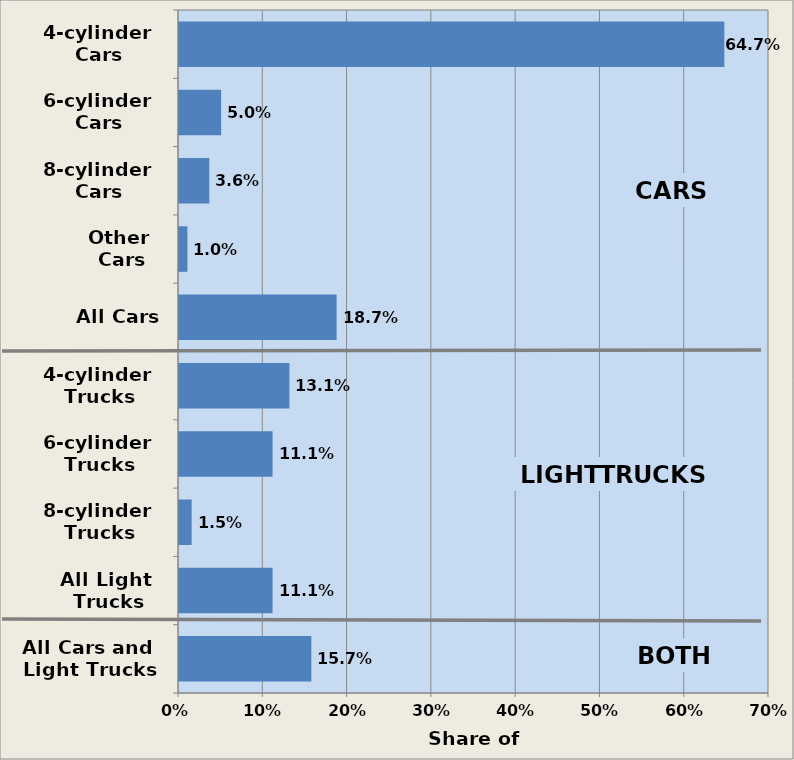
| Category | Series 0 |
|---|---|
| All Cars and 
Light Trucks | 0.157 |
| All Light 
Trucks | 0.111 |
| 8-cylinder 
Trucks | 0.015 |
| 6-cylinder 
Trucks | 0.111 |
| 4-cylinder 
Trucks | 0.131 |
| All Cars | 0.187 |
| Other 
Cars | 0.01 |
| 8-cylinder 
Cars | 0.036 |
| 6-cylinder 
Cars | 0.05 |
| 4-cylinder 
Cars | 0.647 |